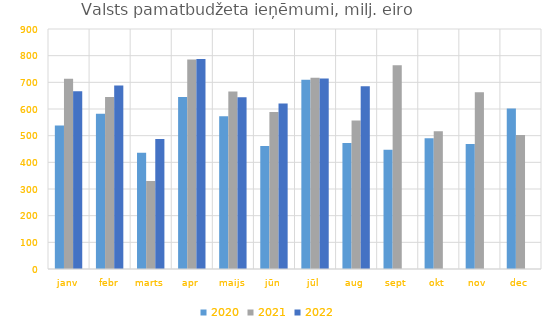
| Category | 2020 | 2021 | 2022 |
|---|---|---|---|
| janv | 537722.948 | 713014.632 | 666661.352 |
| febr | 582097.989 | 644814.957 | 687779.931 |
| marts | 436083.224 | 330339.758 | 487592.334 |
| apr | 645256.276 | 785719.324 | 787062.79 |
| maijs | 572854.69 | 665234.221 | 644004.073 |
| jūn | 461405.873 | 589166.177 | 620273.485 |
| jūl | 709928.085 | 717458.088 | 713962.301 |
| aug | 472605.695 | 557138.062 | 685067.765 |
| sept | 446749.915 | 764496.897 | 0 |
| okt | 490335.515 | 516906.965 | 0 |
| nov | 468560.222 | 662718.632 | 0 |
| dec | 601482.069 | 502474.488 | 0 |